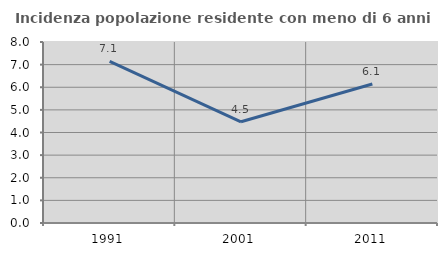
| Category | Incidenza popolazione residente con meno di 6 anni |
|---|---|
| 1991.0 | 7.143 |
| 2001.0 | 4.475 |
| 2011.0 | 6.141 |